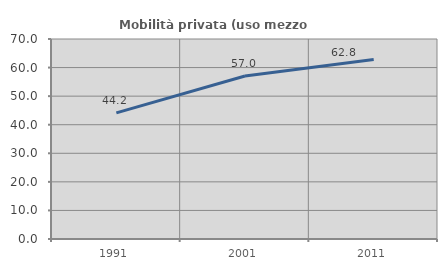
| Category | Mobilità privata (uso mezzo privato) |
|---|---|
| 1991.0 | 44.162 |
| 2001.0 | 57.042 |
| 2011.0 | 62.79 |